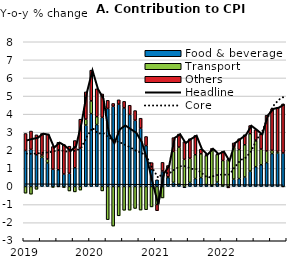
| Category | Food & beverage | Transport | Others |
|---|---|---|---|
| 2019.0 | 1.99 | -0.37 | 0.94 |
| nan | 2.051 | -0.425 | 1.014 |
| nan | 1.751 | -0.156 | 1.105 |
| nan | 1.61 | 0.127 | 1.193 |
| nan | 1.303 | 0.214 | 1.364 |
| nan | 0.957 | -0.049 | 1.251 |
| nan | 0.924 | -0.004 | 1.52 |
| nan | 0.69 | -0.058 | 1.628 |
| nan | 0.729 | -0.248 | 1.5 |
| nan | 1.033 | -0.299 | 1.506 |
| nan | 2.107 | -0.2 | 1.612 |
| nan | 3.394 | 0.33 | 1.506 |
| 2020.0 | 4.028 | 0.703 | 1.699 |
| nan | 3.423 | 0.435 | 1.542 |
| nan | 3.82 | -0.245 | 1.296 |
| nan | 4.313 | -1.834 | 0.451 |
| nan | 4.435 | -2.19 | 0.155 |
| nan | 4.553 | -1.621 | 0.238 |
| nan | 4.343 | -1.316 | 0.362 |
| nan | 3.98 | -1.311 | 0.511 |
| nan | 3.658 | -1.216 | 0.537 |
| nan | 3.226 | -1.304 | 0.548 |
| nan | 2.259 | -1.283 | 0.504 |
| nan | 0.931 | -1.129 | 0.389 |
| 2021.0 | 0.368 | -0.993 | -0.344 |
| nan | 0.857 | -0.633 | 0.477 |
| nan | 0.494 | 0.046 | 0.62 |
| nan | 0.228 | 1.709 | 0.763 |
| nan | 0.123 | 2.054 | 0.723 |
| nan | -0.068 | 1.503 | 0.975 |
| nan | 0.222 | 1.336 | 1.081 |
| nan | 0.438 | 1.318 | 1.064 |
| nan | 0.492 | 1.313 | 0.255 |
| nan | 0.106 | 1.597 | 0.067 |
| nan | 0.039 | 2.003 | 0.058 |
| nan | 0.239 | 1.529 | 0.042 |
| 2022.0 | 0.028 | 1.407 | 0.505 |
| nan | -0.007 | 1.495 | -0.068 |
| nan | 0.408 | 1.769 | 0.233 |
| nan | 0.437 | 1.604 | 0.599 |
| nan | 0.524 | 1.781 | 0.554 |
| nan | 0.85 | 2.07 | 0.45 |
| nan | 1.094 | 1.472 | 0.574 |
| nan | 1.202 | 0.864 | 0.823 |
| nan | 1.319 | 0.646 | 1.975 |
| nan | 1.82 | 0.175 | 2.305 |
| nan | 1.852 | 0.091 | 2.427 |
| nan | 1.852 | -0.015 | 2.712 |